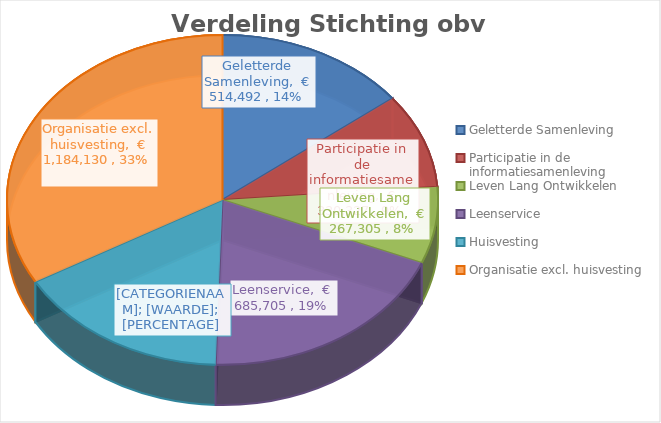
| Category | Series 0 |
|---|---|
| Geletterde Samenleving | 514491.592 |
| Participatie in de informatiesamenleving | 330327.263 |
| Leven Lang Ontwikkelen | 267305.214 |
| Leenservice | 685705.415 |
| Huisvesting | 578000 |
| Organisatie excl. huisvesting | 1184129.941 |